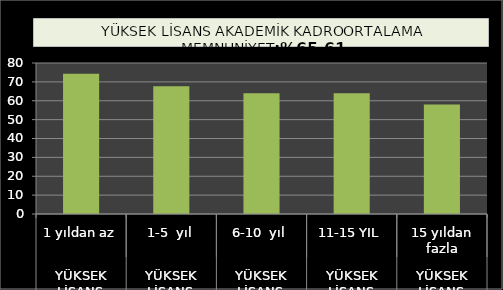
| Category | Series 0 |
|---|---|
| 0 | 74.37 |
| 1 | 67.7 |
| 2 | 64 |
| 3 | 64 |
| 4 | 58 |